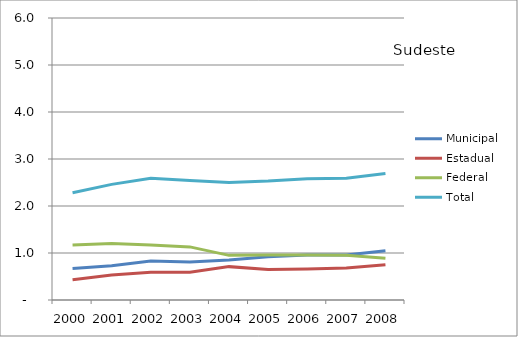
| Category | Municipal | Estadual | Federal | Total |
|---|---|---|---|---|
| 2000.0 | 0.67 | 0.43 | 1.17 | 2.28 |
| 2001.0 | 0.73 | 0.53 | 1.2 | 2.46 |
| 2002.0 | 0.83 | 0.59 | 1.17 | 2.59 |
| 2003.0 | 0.81 | 0.59 | 1.13 | 2.54 |
| 2004.0 | 0.85 | 0.71 | 0.95 | 2.5 |
| 2005.0 | 0.92 | 0.65 | 0.96 | 2.53 |
| 2006.0 | 0.96 | 0.66 | 0.96 | 2.58 |
| 2007.0 | 0.96 | 0.68 | 0.95 | 2.59 |
| 2008.0 | 1.05 | 0.75 | 0.89 | 2.69 |